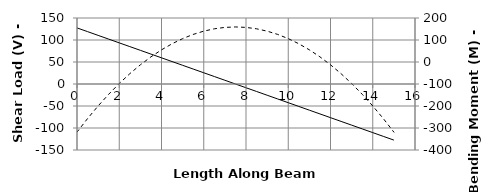
| Category | V |
|---|---|
| 0.0 | 127.5 |
| 0.0 | 127.5 |
| 0.0 | 127.5 |
| 0.5 | 119 |
| 1.0 | 110.5 |
| 1.5 | 102 |
| 2.0 | 93.5 |
| 2.5 | 85 |
| 3.0 | 76.5 |
| 3.5 | 68 |
| 4.0 | 59.5 |
| 4.5 | 51 |
| 5.0 | 42.5 |
| 5.5 | 34 |
| 6.0 | 25.5 |
| 6.5 | 17 |
| 7.0 | 8.5 |
| 7.5 | 0 |
| 7.5 | 0 |
| 7.5 | 0 |
| 8.0 | -8.5 |
| 8.5 | -17 |
| 9.0 | -25.5 |
| 9.5 | -34 |
| 10.0 | -42.5 |
| 10.5 | -51 |
| 11.0 | -59.5 |
| 11.5 | -68 |
| 12.0 | -76.5 |
| 12.5 | -85 |
| 13.0 | -93.5 |
| 13.5 | -102 |
| 14.0 | -110.5 |
| 14.5 | -119 |
| 15.0 | -127.5 |